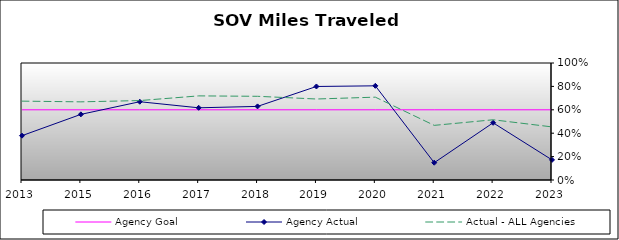
| Category | Agency Goal | Agency Actual | Actual - ALL Agencies |
|---|---|---|---|
| 2013.0 | 0.6 | 0.379 | 0.674 |
| 2015.0 | 0.6 | 0.561 | 0.668 |
| 2016.0 | 0.6 | 0.669 | 0.679 |
| 2017.0 | 0.6 | 0.617 | 0.719 |
| 2018.0 | 0.6 | 0.629 | 0.715 |
| 2019.0 | 0.6 | 0.799 | 0.692 |
| 2020.0 | 0.6 | 0.805 | 0.708 |
| 2021.0 | 0.6 | 0.148 | 0.467 |
| 2022.0 | 0.6 | 0.489 | 0.515 |
| 2023.0 | 0.6 | 0.172 | 0.454 |